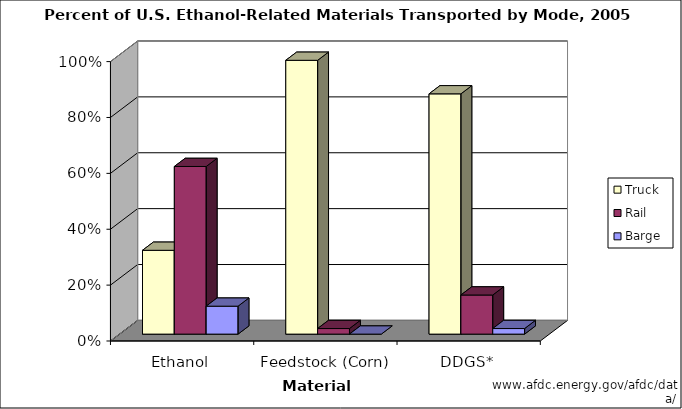
| Category | Truck | Rail | Barge |
|---|---|---|---|
| Ethanol | 0.3 | 0.6 | 0.1 |
| Feedstock (Corn) | 0.98 | 0.02 | 0 |
| DDGS* | 0.86 | 0.14 | 0.02 |